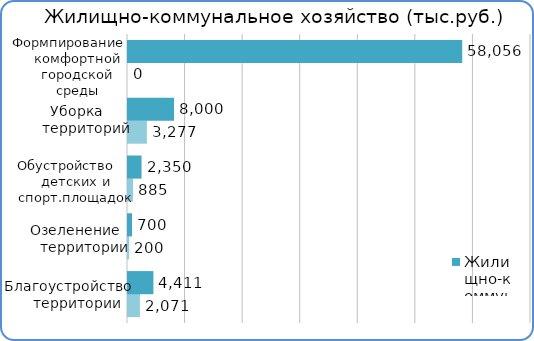
| Category | Факт | План  |
|---|---|---|
| Благоустройство территории | 2071100 | 4411400 |
| Озеленение территории | 199800 | 700000 |
| Обустройство детских и спортивных площадок | 885100 | 2350000 |
| Уборка территорий | 3276900 | 8000000 |
| Формирование комфортной городской среды | 0 | 58055700 |